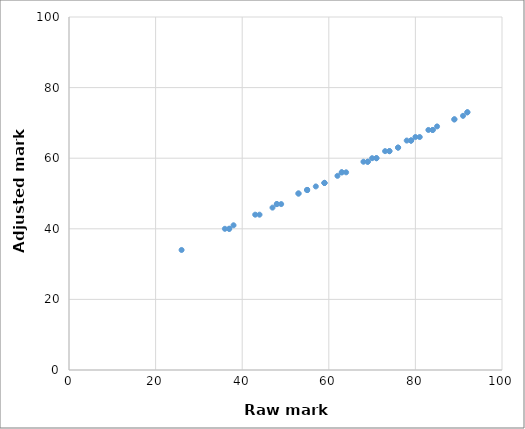
| Category | Series 0 |
|---|---|
| 79.0 | 65 |
| 69.0 | 59 |
| 43.0 | 44 |
| 74.0 | 62 |
| 68.0 | 59 |
| 44.0 | 44 |
| 70.0 | 60 |
| 85.0 | 69 |
| 63.0 | 56 |
| 89.0 | 71 |
| 36.0 | 40 |
| 89.0 | 71 |
| 69.0 | 59 |
| 84.0 | 68 |
| 79.0 | 65 |
| 79.0 | 65 |
| 53.0 | 50 |
| 71.0 | 60 |
| 81.0 | 66 |
| 48.0 | 47 |
| 59.0 | 53 |
| 57.0 | 52 |
| 73.0 | 62 |
| 55.0 | 51 |
| 80.0 | 66 |
| 26.0 | 34 |
| 83.0 | 68 |
| 59.0 | 53 |
| 74.0 | 62 |
| 59.0 | 53 |
| 49.0 | 47 |
| 63.0 | 56 |
| 37.0 | 40 |
| 76.0 | 63 |
| 38.0 | 41 |
| 78.0 | 65 |
| 55.0 | 51 |
| 91.0 | 72 |
| 48.0 | 47 |
| 37.0 | 40 |
| 47.0 | 46 |
| 92.0 | 73 |
| 84.0 | 68 |
| 53.0 | 50 |
| 92.0 | 73 |
| 62.0 | 55 |
| 76.0 | 63 |
| 55.0 | 51 |
| 64.0 | 56 |
| 71.0 | 60 |